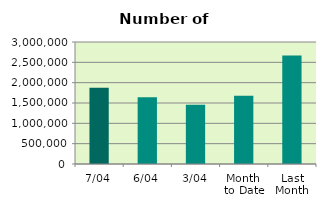
| Category | Series 0 |
|---|---|
| 7/04 | 1876936 |
| 6/04 | 1642562 |
| 3/04 | 1456278 |
| Month 
to Date | 1680718 |
| Last
Month | 2666736.455 |